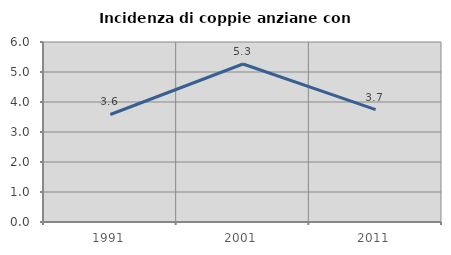
| Category | Incidenza di coppie anziane con figli |
|---|---|
| 1991.0 | 3.584 |
| 2001.0 | 5.267 |
| 2011.0 | 3.744 |